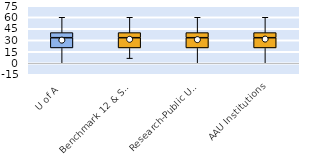
| Category | 25th | 50th | 75th |
|---|---|---|---|
| U of A | 20 | 13.333 | 6.667 |
| Benchmark 12 & SEC | 20 | 13.333 | 6.667 |
| Research-Public Univ | 20 | 13.333 | 6.667 |
| AAU Institutions | 20 | 13.333 | 6.667 |